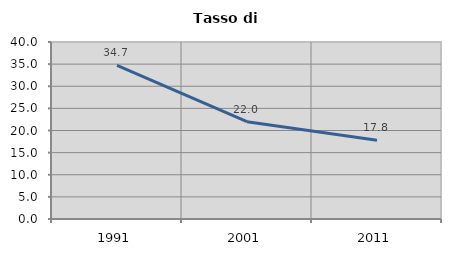
| Category | Tasso di disoccupazione   |
|---|---|
| 1991.0 | 34.742 |
| 2001.0 | 21.986 |
| 2011.0 | 17.819 |